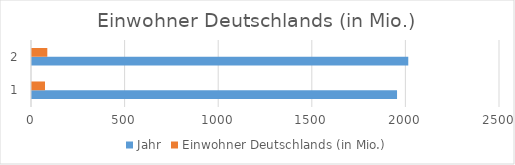
| Category | Jahr | Einwohner Deutschlands (in Mio.) |
|---|---|---|
| 0 | 1950 | 69.3 |
| 1 | 2010 | 81.8 |